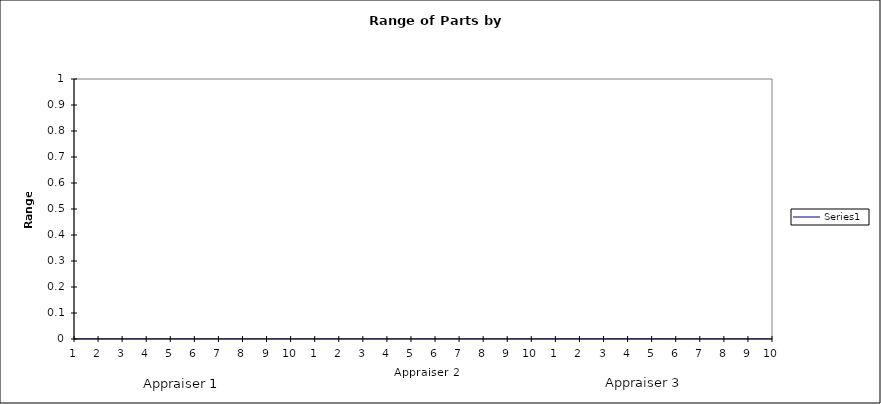
| Category | Series 0 | UCL | Rave |
|---|---|---|---|
| 1 | 0 |  |  |
| 2 | 0 |  |  |
| 3 | 0 |  |  |
| 4 | 0 |  |  |
| 5 | 0 |  |  |
| 6 | 0 |  |  |
| 7 | 0 |  |  |
| 8 | 0 |  |  |
| 9 | 0 |  |  |
| 10 | 0 |  |  |
| 1 | 0 |  |  |
| 2 | 0 |  |  |
| 3 | 0 |  |  |
| 4 | 0 |  |  |
| 5 | 0 |  |  |
| 6 | 0 |  |  |
| 7 | 0 |  |  |
| 8 | 0 |  |  |
| 9 | 0 |  |  |
| 10 | 0 |  |  |
| 1 | 0 |  |  |
| 2 | 0 |  |  |
| 3 | 0 |  |  |
| 4 | 0 |  |  |
| 5 | 0 |  |  |
| 6 | 0 |  |  |
| 7 | 0 |  |  |
| 8 | 0 |  |  |
| 9 | 0 |  |  |
| 10 | 0 |  |  |